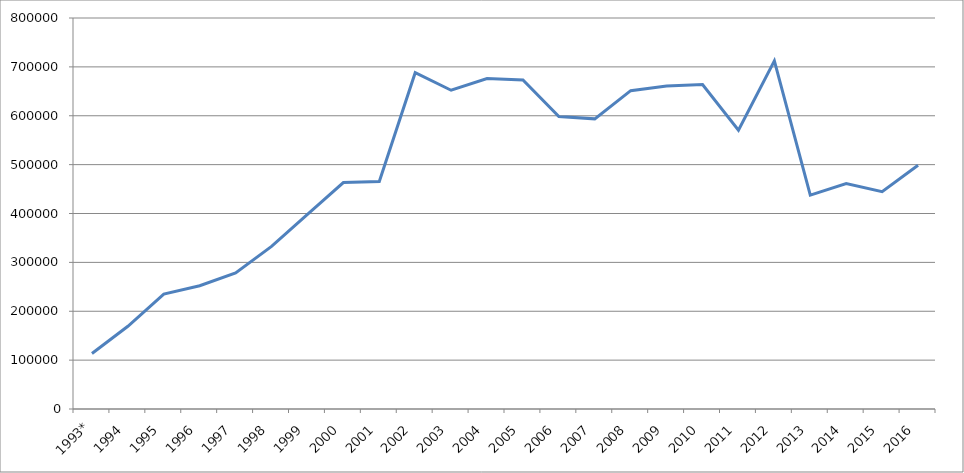
| Category | Series 0 |
|---|---|
| 1993* | 113604 |
| 1994 | 169194 |
| 1995 | 235003 |
| 1996 | 252245 |
| 1997 | 278329 |
| 1998 | 332605 |
| 1999 | 398115 |
| 2000 | 463292 |
| 2001 | 465621 |
| 2002 | 688159 |
| 2003 | 652186.4 |
| 2004 | 676150.6 |
| 2005 | 673292 |
| 2006 | 598272.17 |
| 2007 | 593615.71 |
| 2008 | 651308.3 |
| 2009 | 660808.9 |
| 2010 | 663735.3 |
| 2011 | 570393.5 |
| 2012 | 712334.5 |
| 2013 | 437670 |
| 2014 | 461063.83 |
| 2015 | 444537.1 |
| 2016 | 498882.64 |